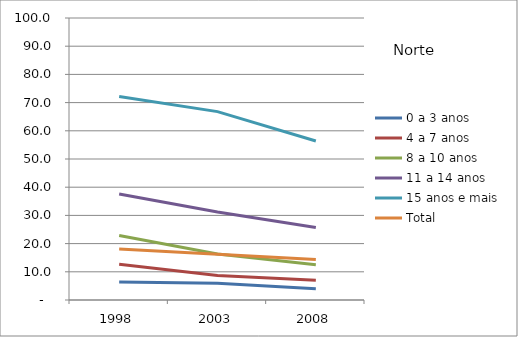
| Category | 0 a 3 anos | 4 a 7 anos | 8 a 10 anos | 11 a 14 anos | 15 anos e mais | Total |
|---|---|---|---|---|---|---|
| 1998.0 | 6.4 | 12.7 | 22.9 | 37.6 | 72.2 | 18.1 |
| 2003.0 | 5.9 | 8.7 | 16.3 | 31.2 | 66.8 | 16.2 |
| 2008.0 | 4 | 7 | 12.5 | 25.7 | 56.4 | 14.4 |